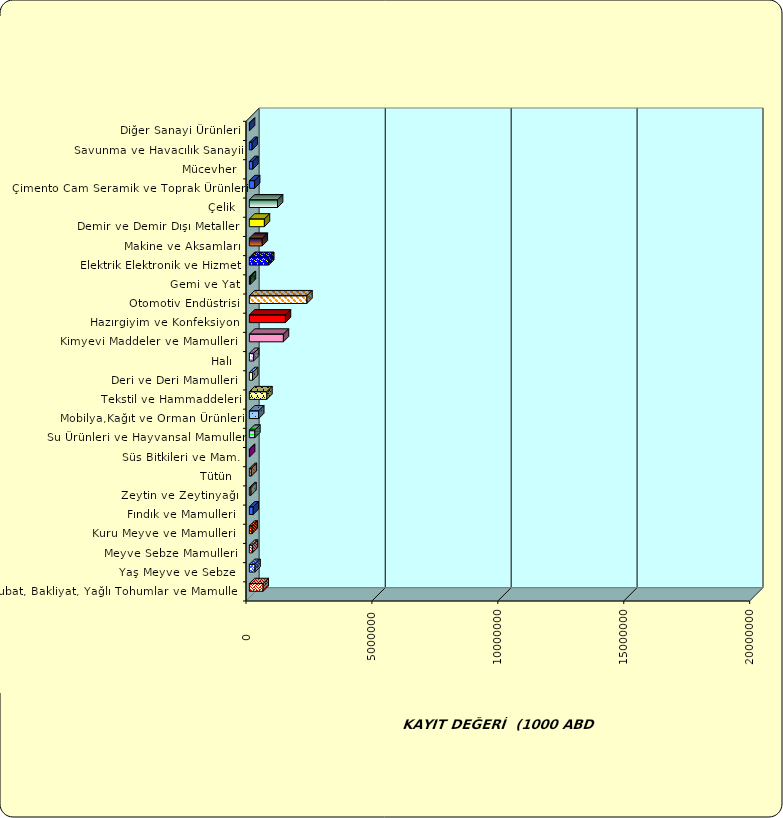
| Category | Series 0 |
|---|---|
|  Hububat, Bakliyat, Yağlı Tohumlar ve Mamulleri  | 548129.169 |
|  Yaş Meyve ve Sebze   | 225806.913 |
|  Meyve Sebze Mamulleri  | 120119.824 |
|  Kuru Meyve ve Mamulleri   | 108847.16 |
|  Fındık ve Mamulleri  | 155137.427 |
|  Zeytin ve Zeytinyağı  | 63499.138 |
|  Tütün  | 77912.085 |
|  Süs Bitkileri ve Mam. | 8699.759 |
|  Su Ürünleri ve Hayvansal Mamuller | 218448.596 |
|  Mobilya,Kağıt ve Orman Ürünleri | 371528.796 |
|  Tekstil ve Hammaddeleri | 696415.733 |
|  Deri ve Deri Mamulleri  | 129309.662 |
|  Halı  | 169512.613 |
|  Kimyevi Maddeler ve Mamulleri   | 1353176.81 |
|  Hazırgiyim ve Konfeksiyon  | 1433355.49 |
|  Otomotiv Endüstrisi | 2286660.682 |
|  Gemi ve Yat | 42657.505 |
|  Elektrik Elektronik ve Hizmet | 769397.448 |
|  Makine ve Aksamları | 513165.016 |
|  Demir ve Demir Dışı Metaller  | 597891.779 |
|  Çelik | 1119973.617 |
|  Çimento Cam Seramik ve Toprak Ürünleri | 208805.166 |
|  Mücevher | 140108.441 |
|  Savunma ve Havacılık Sanayii | 109261.312 |
|  Diğer Sanayi Ürünleri | 6870.91 |